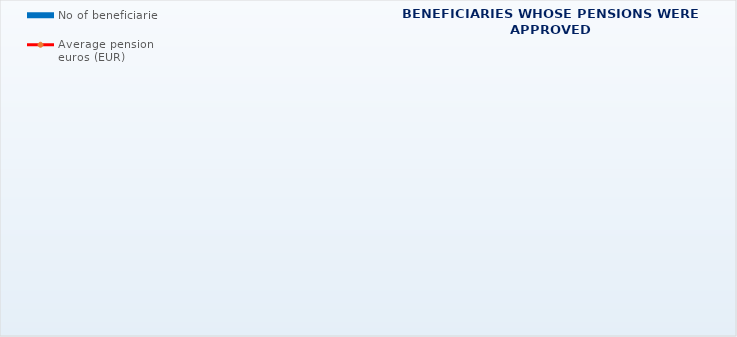
| Category | No of beneficiaries |
|---|---|
| Authorised officials in internal affairs, judicial officers and workers engaged in demining work: | 17183 |
| Pension beneficiaries entitled under the Fire Services Act (Official Gazette 125/19) | 367 |
| Active military personnel - DVO  | 16060 |
| Croatian Homeland Army veterans mobilised from 1941 to 1945 | 1830 |
| Former political prisoners | 2043 |
| Croatian Veterans from the Homeland War - ZOHBDR (Act on Croatian Homeland War Veterans and Their Family Members) | 71267 |
| Pensions approved under general regulations and determined according to the Act on the Rights of Croatian Homeland War Veterans and their Family Members (ZOHBDR), in 2017 (Art. 27, 35, 48 and 49, paragraph 2)    | 58043 |
| Former Yugoslav People's Army members - JNA   | 3568 |
| Former Yugoslav People's Army members - JNA - Art. 185 of Pension Insurance Act (ZOMO)  | 153 |
| National Liberation War veterans - NOR | 4774 |
| Members of the Croatian Parliament, members of the Government, judges of the Constitutional Court and the Auditor General | 680 |
| Members of the Parliamentary Executive Council and administratively retired federal civil servants  (relates to the former SFRY) | 63 |
| Former officials of federal bodies o the former SFRJ -  Article 38 of the Pension Insurance Act (ZOMO) | 17 |
| Full members of the Croatian Academy of Sciences and Arts - HAZU | 123 |
| Miners from the Istrian coal mines "Tupljak" d.d. Labin  | 245 |
| Workers professionally exposed to asbestos | 816 |
| Insurees - crew members on a ship in international and national navigation  - Article  129, paragraph 2 of the Maritime Code | 203 |
| Members of the Croatian Defence Council - HVO  | 6730 |